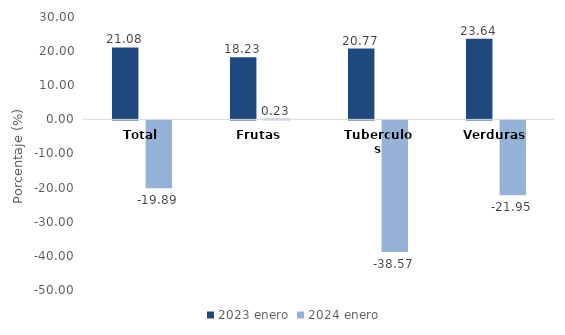
| Category | 2023 | 2024 |
|---|---|---|
| Total | 21.079 | -19.888 |
| Frutas | 18.235 | 0.228 |
| Tuberculos | 20.768 | -38.567 |
| Verduras | 23.642 | -21.952 |